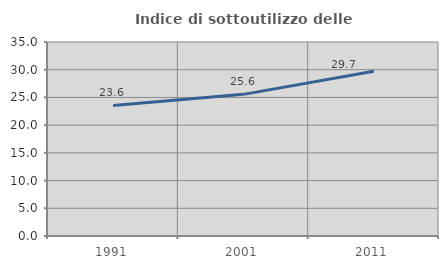
| Category | Indice di sottoutilizzo delle abitazioni  |
|---|---|
| 1991.0 | 23.56 |
| 2001.0 | 25.554 |
| 2011.0 | 29.727 |